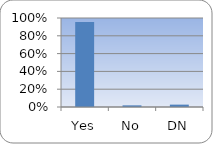
| Category | Series 0 |
|---|---|
| Yes | 0.955 |
| No | 0.018 |
| DN | 0.027 |